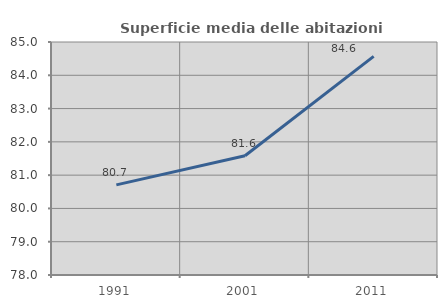
| Category | Superficie media delle abitazioni occupate |
|---|---|
| 1991.0 | 80.709 |
| 2001.0 | 81.584 |
| 2011.0 | 84.568 |